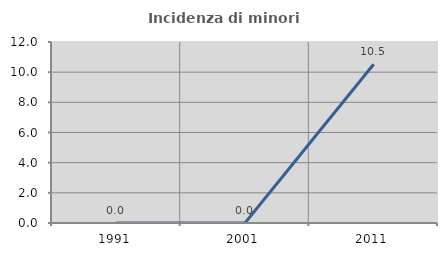
| Category | Incidenza di minori stranieri |
|---|---|
| 1991.0 | 0 |
| 2001.0 | 0 |
| 2011.0 | 10.526 |